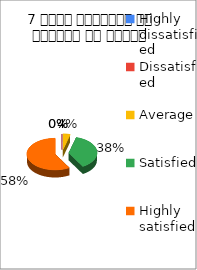
| Category | 7 विषय अवधारणा पर शिक्षक का ज्ञान  |
|---|---|
| Highly dissatisfied | 0 |
| Dissatisfied | 0 |
| Average | 1 |
| Satisfied | 9 |
| Highly satisfied | 14 |